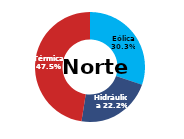
| Category | Norte |
|---|---|
| Eólica | 91.657 |
| Hidráulica | 67.3 |
| Solar | 0 |
| Térmica | 143.985 |